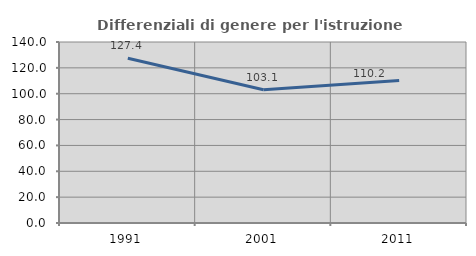
| Category | Differenziali di genere per l'istruzione superiore |
|---|---|
| 1991.0 | 127.428 |
| 2001.0 | 103.09 |
| 2011.0 | 110.171 |